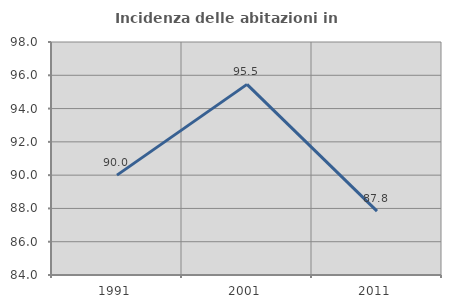
| Category | Incidenza delle abitazioni in proprietà  |
|---|---|
| 1991.0 | 90 |
| 2001.0 | 95.455 |
| 2011.0 | 87.838 |